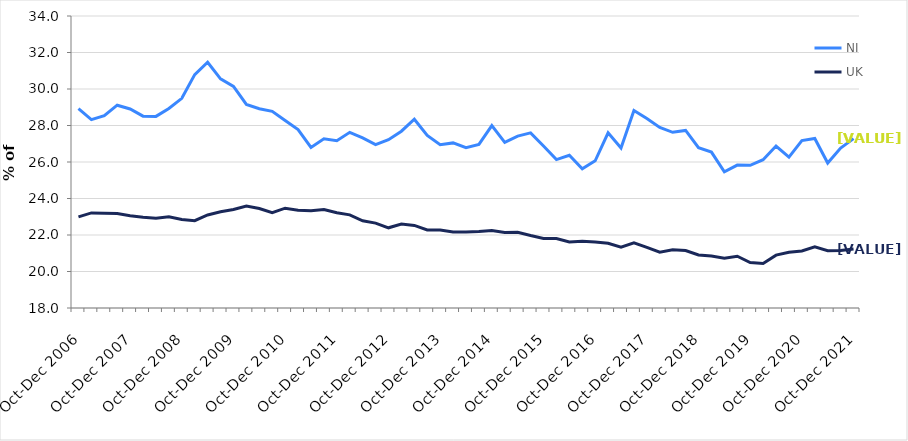
| Category | NI | UK |
|---|---|---|
| Oct-Dec 2006 | 28.92 | 22.992 |
| Jan-Mar 2007 | 28.32 | 23.21 |
| Apr-Jun 2007 | 28.541 | 23.196 |
| Jul-Sep 2007 | 29.113 | 23.179 |
| Oct-Dec 2007 | 28.904 | 23.058 |
| Jan-Mar 2008 | 28.512 | 22.974 |
| Apr-Jun 2008 | 28.5 | 22.917 |
| Jul-Sep 2008 | 28.937 | 22.996 |
| Oct-Dec 2008 | 29.489 | 22.851 |
| Jan-Mar 2009 | 30.792 | 22.786 |
| Apr-Jun 2009 | 31.467 | 23.097 |
| Jul-Sep 2009 | 30.556 | 23.27 |
| Oct-Dec 2009 | 30.141 | 23.397 |
| Jan-Mar 2010 | 29.156 | 23.588 |
| Apr-Jun 2010 | 28.921 | 23.451 |
| Jul-Sep 2010 | 28.774 | 23.219 |
| Oct-Dec 2010 | 28.271 | 23.468 |
| Jan-Mar 2011 | 27.775 | 23.36 |
| Apr-Jun 2011 | 26.796 | 23.329 |
| Jul-Sep 2011 | 27.268 | 23.397 |
| Oct-Dec 2011 | 27.162 | 23.215 |
| Jan-Mar 2012 | 27.624 | 23.102 |
| Apr-Jun 2012 | 27.319 | 22.778 |
| Jul-Sep 2012 | 26.95 | 22.65 |
| Oct-Dec 2012 | 27.223 | 22.394 |
| Jan-Mar 2013 | 27.687 | 22.596 |
| Apr-Jun 2013 | 28.342 | 22.526 |
| Jul-Sep 2013 | 27.453 | 22.276 |
| Oct-Dec 2013 | 26.952 | 22.273 |
| Jan-Mar 2014 | 27.046 | 22.16 |
| Apr-Jun 2014 | 26.785 | 22.163 |
| Jul-Sep 2014 | 26.965 | 22.188 |
| Oct-Dec 2014 | 27.993 | 22.252 |
| Jan-Mar 2015 | 27.073 | 22.142 |
| Apr-Jun 2015 | 27.421 | 22.145 |
| Jul-Sep 2015 | 27.594 | 21.97 |
| Oct-Dec 2015 | 26.877 | 21.812 |
| Jan-Mar 2016 | 26.132 | 21.803 |
| Apr-Jun 2016 | 26.367 | 21.623 |
| Jul-Sep 2016 | 25.625 | 21.656 |
| Oct-Dec 2016 | 26.067 | 21.619 |
| Jan-Mar 2017 | 27.6 | 21.55 |
| Apr-Jun 2017 | 26.77 | 21.333 |
| Jul-Sep 2017 | 28.826 | 21.576 |
| Oct-Dec 2017 | 28.379 | 21.325 |
| Jan-Mar 2018 | 27.894 | 21.055 |
| Apr-Jun 2018 | 27.628 | 21.189 |
| Jul-Sep 2018 | 27.731 | 21.147 |
| Oct-Dec 2018 | 26.784 | 20.91 |
| Jan-Mar 2019 | 26.543 | 20.844 |
| Apr-Jun 2019 | 25.457 | 20.721 |
| Jul-Sep 2019 | 25.833 | 20.838 |
| Oct-Dec 2019 | 25.816 | 20.491 |
| Jan-Mar 2020 | 26.126 | 20.437 |
| Apr-Jun 2020 | 26.875 | 20.896 |
| Jul-Sep 2020 | 26.267 | 21.05 |
| Oct-Dec 2020 | 27.177 | 21.129 |
| Jan-Mar 2021 | 27.288 | 21.352 |
| Apr-Jun 2021 | 25.942 | 21.139 |
| Jul-Sep 2021 | 26.766 | 21.15 |
| Oct-Dec 2021 | 27.283 | 21.228 |